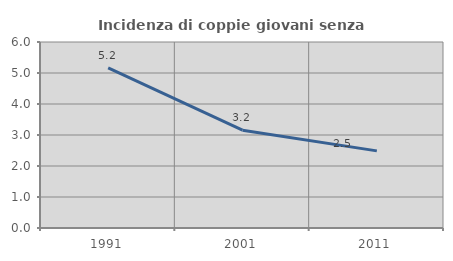
| Category | Incidenza di coppie giovani senza figli |
|---|---|
| 1991.0 | 5.168 |
| 2001.0 | 3.155 |
| 2011.0 | 2.488 |